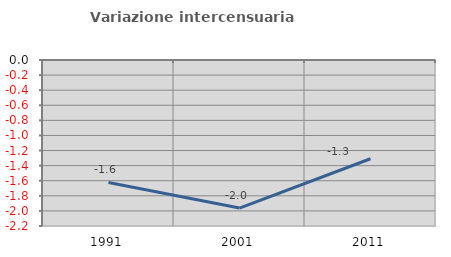
| Category | Variazione intercensuaria annua |
|---|---|
| 1991.0 | -1.622 |
| 2001.0 | -1.962 |
| 2011.0 | -1.309 |